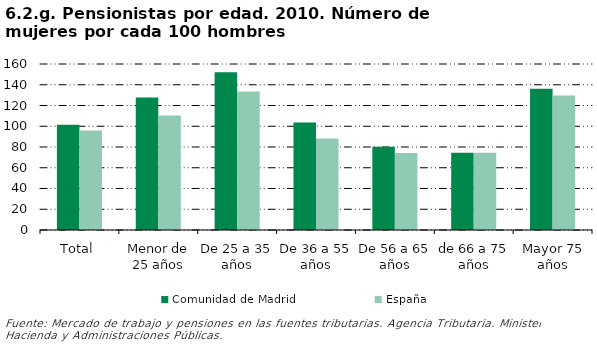
| Category | Comunidad de Madrid | España |
|---|---|---|
| Total | 101.517 | 95.945 |
| Menor de 25 años | 127.689 | 110.257 |
| De 25 a 35 años | 151.982 | 133.501 |
| De 36 a 55 años | 103.572 | 88.153 |
| De 56 a 65 años | 80.319 | 74.199 |
| de 66 a 75 años | 74.562 | 74.35 |
| Mayor 75 años | 136.124 | 129.66 |